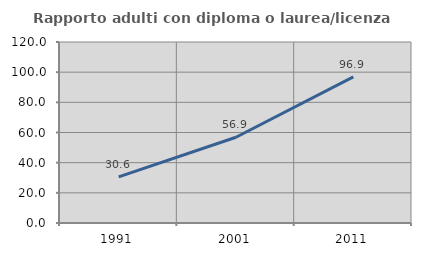
| Category | Rapporto adulti con diploma o laurea/licenza media  |
|---|---|
| 1991.0 | 30.612 |
| 2001.0 | 56.853 |
| 2011.0 | 96.875 |